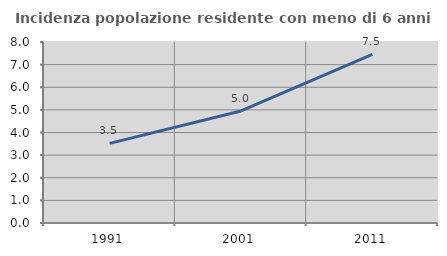
| Category | Incidenza popolazione residente con meno di 6 anni |
|---|---|
| 1991.0 | 3.518 |
| 2001.0 | 4.95 |
| 2011.0 | 7.456 |